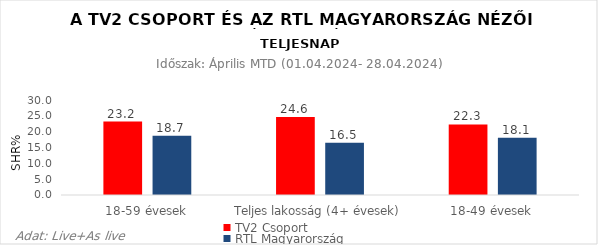
| Category | TV2 Csoport | RTL Magyarország |
|---|---|---|
| 18-59 évesek | 23.2 | 18.7 |
| Teljes lakosság (4+ évesek) | 24.6 | 16.5 |
| 18-49 évesek | 22.3 | 18.1 |